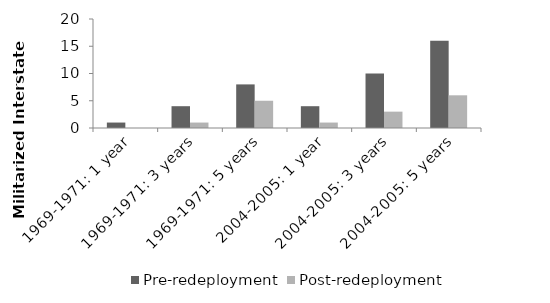
| Category | Pre-redeployment | Post-redeployment |
|---|---|---|
| 1969-1971: 1 year | 1 | 0 |
| 1969-1971: 3 years | 4 | 1 |
| 1969-1971: 5 years | 8 | 5 |
| 2004-2005: 1 year | 4 | 1 |
| 2004-2005: 3 years | 10 | 3 |
| 2004-2005: 5 years | 16 | 6 |